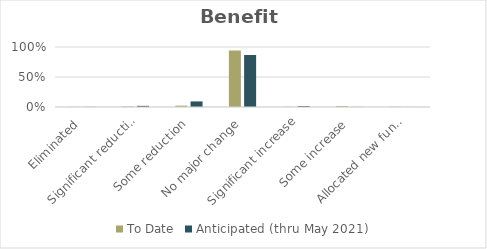
| Category | To Date | Anticipated (thru May 2021) |
|---|---|---|
| Eliminated | 0.003 | 0.003 |
| Significant reduction | 0.009 | 0.019 |
| Some reduction | 0.023 | 0.093 |
| No major change | 0.941 | 0.867 |
| Significant increase | 0.004 | 0.015 |
| Some increase | 0.016 | 0.002 |
| Allocated new funding | 0.005 | 0.001 |